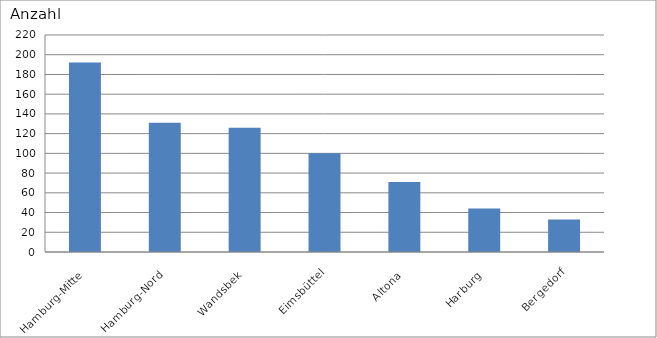
| Category | Hamburg-Mitte Hamburg-Nord Wandsbek Eimsbüttel Altona Harburg Bergedorf |
|---|---|
| Hamburg-Mitte | 192 |
| Hamburg-Nord | 131 |
| Wandsbek | 126 |
| Eimsbüttel | 100 |
| Altona | 71 |
| Harburg | 44 |
| Bergedorf | 33 |